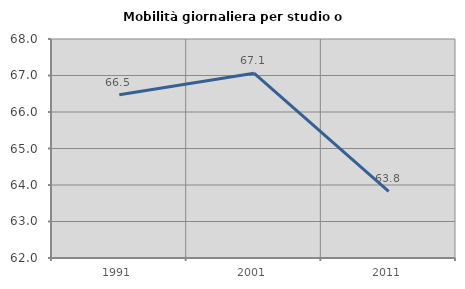
| Category | Mobilità giornaliera per studio o lavoro |
|---|---|
| 1991.0 | 66.473 |
| 2001.0 | 67.063 |
| 2011.0 | 63.827 |